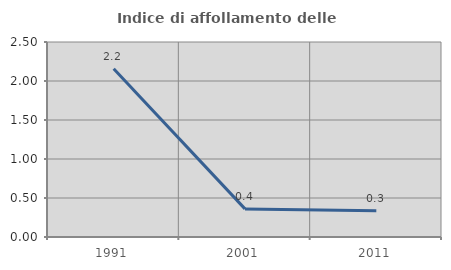
| Category | Indice di affollamento delle abitazioni  |
|---|---|
| 1991.0 | 2.158 |
| 2001.0 | 0.36 |
| 2011.0 | 0.336 |